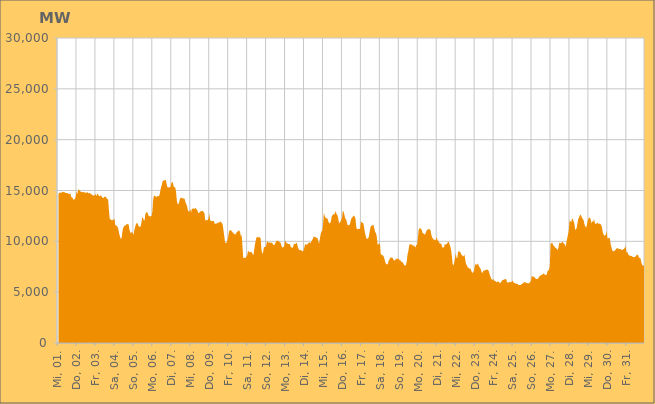
| Category | Series 0 |
|---|---|
|  Mi, 01.  | 14655.966 |
|  Mi, 01.  | 14733.748 |
|  Mi, 01.  | 14804.846 |
|  Mi, 01.  | 14791.034 |
|  Mi, 01.  | 14763.967 |
|  Mi, 01.  | 14899.426 |
|  Mi, 01.  | 14825.837 |
|  Mi, 01.  | 14856.892 |
|  Mi, 01.  | 14807.386 |
|  Mi, 01.  | 14771.504 |
|  Mi, 01.  | 14743.15 |
|  Mi, 01.  | 14767.575 |
|  Mi, 01.  | 14703.543 |
|  Mi, 01.  | 14668.811 |
|  Mi, 01.  | 14644.335 |
|  Mi, 01.  | 14748.163 |
|  Mi, 01.  | 14457.751 |
|  Do, 02.  | 14296.207 |
|  Do, 02.  | 14301.29 |
|  Do, 02.  | 14071.643 |
|  Do, 02.  | 14125.395 |
|  Do, 02.  | 14167.419 |
|  Do, 02.  | 14390.303 |
|  Do, 02.  | 14927.749 |
|  Do, 02.  | 14657.28 |
|  Do, 02.  | 15013.961 |
|  Do, 02.  | 15149.271 |
|  Do, 02.  | 14961.237 |
|  Do, 02.  | 14913.156 |
|  Do, 02.  | 14853.359 |
|  Do, 02.  | 14848.68 |
|  Do, 02.  | 14835.157 |
|  Do, 02.  | 14822.42 |
|  Do, 02.  | 14853.981 |
|  Do, 02.  | 14778.244 |
|  Do, 02.  | 14739.661 |
|  Do, 02.  | 14820.942 |
|  Do, 02.  | 14820.957 |
|  Do, 02.  | 14718.291 |
|  Do, 02.  | 14730.141 |
|  Do, 02.  | 14781.562 |
|  Fr, 03.  | 14643.822 |
|  Fr, 03.  | 14619.324 |
|  Fr, 03.  | 14570.487 |
|  Fr, 03.  | 14487.063 |
|  Fr, 03.  | 14517.622 |
|  Fr, 03.  | 14554.24 |
|  Fr, 03.  | 14644.859 |
|  Fr, 03.  | 14437.796 |
|  Fr, 03.  | 14649.717 |
|  Fr, 03.  | 14646.284 |
|  Fr, 03.  | 14511.99 |
|  Fr, 03.  | 14435.93 |
|  Fr, 03.  | 14480.749 |
|  Fr, 03.  | 14536.33 |
|  Fr, 03.  | 14358.814 |
|  Fr, 03.  | 14281.445 |
|  Fr, 03.  | 14267.614 |
|  Fr, 03.  | 14359.281 |
|  Fr, 03.  | 14385.518 |
|  Fr, 03.  | 14390.92 |
|  Fr, 03.  | 14251.974 |
|  Fr, 03.  | 14168.814 |
|  Fr, 03.  | 14084.986 |
|  Fr, 03.  | 13032.627 |
|  Sa, 04.  | 12193.395 |
|  Sa, 04.  | 12174.506 |
|  Sa, 04.  | 12064.369 |
|  Sa, 04.  | 12116.496 |
|  Sa, 04.  | 12049.264 |
|  Sa, 04.  | 12166.393 |
|  Sa, 04.  | 12240.616 |
|  Sa, 04.  | 11534.338 |
|  Sa, 04.  | 11638.013 |
|  Sa, 04.  | 11459.933 |
|  Sa, 04.  | 11425.39 |
|  Sa, 04.  | 11158.78 |
|  Sa, 04.  | 10715.435 |
|  Sa, 04.  | 10470.063 |
|  Sa, 04.  | 10229.081 |
|  Sa, 04.  | 10337.311 |
|  Sa, 04.  | 10959.154 |
|  Sa, 04.  | 11320.533 |
|  Sa, 04.  | 11459.781 |
|  Sa, 04.  | 11569.307 |
|  Sa, 04.  | 11539.405 |
|  Sa, 04.  | 11676.312 |
|  Sa, 04.  | 11706.265 |
|  Sa, 04.  | 11683.56 |
|  So, 05.  | 11644.197 |
|  So, 05.  | 11117.941 |
|  So, 05.  | 10881.106 |
|  So, 05.  | 10810.582 |
|  So, 05.  | 10949.285 |
|  So, 05.  | 10815.55 |
|  So, 05.  | 10597.796 |
|  So, 05.  | 11069.342 |
|  So, 05.  | 11359.783 |
|  So, 05.  | 11661.53 |
|  So, 05.  | 11791.91 |
|  So, 05.  | 11768.735 |
|  So, 05.  | 11592.437 |
|  So, 05.  | 11421.68 |
|  So, 05.  | 11423.706 |
|  So, 05.  | 11461.153 |
|  So, 05.  | 11776.889 |
|  So, 05.  | 12301.117 |
|  So, 05.  | 12373.301 |
|  So, 05.  | 12072.689 |
|  So, 05.  | 12047.05 |
|  So, 05.  | 12632.758 |
|  So, 05.  | 12863.411 |
|  So, 05.  | 12871.145 |
|  Mo, 06.  | 12777.506 |
|  Mo, 06.  | 12500.077 |
|  Mo, 06.  | 12519.047 |
|  Mo, 06.  | 12425.348 |
|  Mo, 06.  | 12480.143 |
|  Mo, 06.  | 12503.71 |
|  Mo, 06.  | 12985.8 |
|  Mo, 06.  | 14141.296 |
|  Mo, 06.  | 14486.816 |
|  Mo, 06.  | 14479.297 |
|  Mo, 06.  | 14420.485 |
|  Mo, 06.  | 14339.729 |
|  Mo, 06.  | 14455.014 |
|  Mo, 06.  | 14435.036 |
|  Mo, 06.  | 14445.582 |
|  Mo, 06.  | 14553.014 |
|  Mo, 06.  | 14960.045 |
|  Mo, 06.  | 15339.818 |
|  Mo, 06.  | 15574.39 |
|  Mo, 06.  | 15935.479 |
|  Mo, 06.  | 15948.241 |
|  Mo, 06.  | 15994.346 |
|  Mo, 06.  | 16014.523 |
|  Mo, 06.  | 16040.589 |
|  Di, 07.  | 15623.755 |
|  Di, 07.  | 15329.764 |
|  Di, 07.  | 15319.923 |
|  Di, 07.  | 15295.923 |
|  Di, 07.  | 15325.479 |
|  Di, 07.  | 15353.858 |
|  Di, 07.  | 15687.191 |
|  Di, 07.  | 15885.565 |
|  Di, 07.  | 15734.239 |
|  Di, 07.  | 15371.629 |
|  Di, 07.  | 15337.72 |
|  Di, 07.  | 15266.961 |
|  Di, 07.  | 14812.742 |
|  Di, 07.  | 13936.689 |
|  Di, 07.  | 13680.75 |
|  Di, 07.  | 13635.398 |
|  Di, 07.  | 13896.718 |
|  Di, 07.  | 14272.121 |
|  Di, 07.  | 14221.46 |
|  Di, 07.  | 14313.201 |
|  Di, 07.  | 14235.826 |
|  Di, 07.  | 14212.044 |
|  Di, 07.  | 14216.964 |
|  Di, 07.  | 14129.617 |
|  Mi, 08.  | 13808.596 |
|  Mi, 08.  | 13652.023 |
|  Mi, 08.  | 13402.65 |
|  Mi, 08.  | 13042.164 |
|  Mi, 08.  | 12917.61 |
|  Mi, 08.  | 12934.902 |
|  Mi, 08.  | 13178.913 |
|  Mi, 08.  | 12840.211 |
|  Mi, 08.  | 13221.118 |
|  Mi, 08.  | 13189.868 |
|  Mi, 08.  | 13233.706 |
|  Mi, 08.  | 13205.625 |
|  Mi, 08.  | 13252.785 |
|  Mi, 08.  | 13244.731 |
|  Mi, 08.  | 13130.998 |
|  Mi, 08.  | 13035.237 |
|  Mi, 08.  | 12796.304 |
|  Mi, 08.  | 12768.709 |
|  Mi, 08.  | 12902.595 |
|  Mi, 08.  | 12952.829 |
|  Mi, 08.  | 12967.489 |
|  Mi, 08.  | 13003.67 |
|  Mi, 08.  | 12953.156 |
|  Mi, 08.  | 12870.957 |
|  Do, 09.  | 12730.927 |
|  Do, 09.  | 12003.933 |
|  Do, 09.  | 12110.613 |
|  Do, 09.  | 12075.65 |
|  Do, 09.  | 12089.789 |
|  Do, 09.  | 12244.711 |
|  Do, 09.  | 12779.967 |
|  Do, 09.  | 12062.823 |
|  Do, 09.  | 12056.388 |
|  Do, 09.  | 11965.553 |
|  Do, 09.  | 12000.667 |
|  Do, 09.  | 12013.82 |
|  Do, 09.  | 11974.098 |
|  Do, 09.  | 11671.25 |
|  Do, 09.  | 11748.517 |
|  Do, 09.  | 11748.418 |
|  Do, 09.  | 11763.284 |
|  Do, 09.  | 11872.552 |
|  Do, 09.  | 11832.848 |
|  Do, 09.  | 11880.442 |
|  Do, 09.  | 11955.568 |
|  Do, 09.  | 11895.108 |
|  Do, 09.  | 11790.117 |
|  Do, 09.  | 11633.602 |
|  Fr, 10.  | 11067.153 |
|  Fr, 10.  | 10501.582 |
|  Fr, 10.  | 9869.382 |
|  Fr, 10.  | 9847.542 |
|  Fr, 10.  | 9893.957 |
|  Fr, 10.  | 10141.984 |
|  Fr, 10.  | 10489.722 |
|  Fr, 10.  | 10958.405 |
|  Fr, 10.  | 11105.193 |
|  Fr, 10.  | 11092.675 |
|  Fr, 10.  | 11033.681 |
|  Fr, 10.  | 10906.27 |
|  Fr, 10.  | 10860.775 |
|  Fr, 10.  | 10737.93 |
|  Fr, 10.  | 10731.035 |
|  Fr, 10.  | 10653.992 |
|  Fr, 10.  | 10812.126 |
|  Fr, 10.  | 10899.976 |
|  Fr, 10.  | 10964.931 |
|  Fr, 10.  | 11050.584 |
|  Fr, 10.  | 11063.817 |
|  Fr, 10.  | 10872.576 |
|  Fr, 10.  | 10494.995 |
|  Fr, 10.  | 10595.172 |
|  Sa, 11.  | 9493.104 |
|  Sa, 11.  | 8325.465 |
|  Sa, 11.  | 8383.988 |
|  Sa, 11.  | 8380.871 |
|  Sa, 11.  | 8381.42 |
|  Sa, 11.  | 8526.643 |
|  Sa, 11.  | 8603.912 |
|  Sa, 11.  | 9046.665 |
|  Sa, 11.  | 9022.051 |
|  Sa, 11.  | 8920.277 |
|  Sa, 11.  | 8928.758 |
|  Sa, 11.  | 8975.622 |
|  Sa, 11.  | 8882.01 |
|  Sa, 11.  | 8713.747 |
|  Sa, 11.  | 8660.94 |
|  Sa, 11.  | 9277.089 |
|  Sa, 11.  | 9780.474 |
|  Sa, 11.  | 10146.337 |
|  Sa, 11.  | 10427.806 |
|  Sa, 11.  | 10410.118 |
|  Sa, 11.  | 10369.918 |
|  Sa, 11.  | 10466.3 |
|  Sa, 11.  | 10363.228 |
|  Sa, 11.  | 10266.48 |
|  So, 12.  | 9208.454 |
|  So, 12.  | 8774.162 |
|  So, 12.  | 8890.21 |
|  So, 12.  | 9382.609 |
|  So, 12.  | 9453.427 |
|  So, 12.  | 9431.643 |
|  So, 12.  | 9552.772 |
|  So, 12.  | 10016.847 |
|  So, 12.  | 9957.488 |
|  So, 12.  | 9859.997 |
|  So, 12.  | 9904.787 |
|  So, 12.  | 9836.543 |
|  So, 12.  | 9886.833 |
|  So, 12.  | 9859.021 |
|  So, 12.  | 9810.344 |
|  So, 12.  | 9649.421 |
|  So, 12.  | 9630.395 |
|  So, 12.  | 9713.14 |
|  So, 12.  | 9888.949 |
|  So, 12.  | 10049.359 |
|  So, 12.  | 10076.963 |
|  So, 12.  | 10018.928 |
|  So, 12.  | 10007.389 |
|  So, 12.  | 9919.556 |
|  Mo, 13.  | 9889.385 |
|  Mo, 13.  | 9674.745 |
|  Mo, 13.  | 9425.693 |
|  Mo, 13.  | 9383.575 |
|  Mo, 13.  | 9469.14 |
|  Mo, 13.  | 9560.055 |
|  Mo, 13.  | 10087.87 |
|  Mo, 13.  | 9948.807 |
|  Mo, 13.  | 9825.674 |
|  Mo, 13.  | 9778.155 |
|  Mo, 13.  | 9731.175 |
|  Mo, 13.  | 9746.002 |
|  Mo, 13.  | 9710.783 |
|  Mo, 13.  | 9478.448 |
|  Mo, 13.  | 9413.707 |
|  Mo, 13.  | 9318.38 |
|  Mo, 13.  | 9454.378 |
|  Mo, 13.  | 9703.296 |
|  Mo, 13.  | 9772.598 |
|  Mo, 13.  | 9742.375 |
|  Mo, 13.  | 9820.493 |
|  Mo, 13.  | 9849.61 |
|  Mo, 13.  | 9432.822 |
|  Mo, 13.  | 9252.312 |
|  Di, 14.  | 9138.523 |
|  Di, 14.  | 9120.539 |
|  Di, 14.  | 9170.79 |
|  Di, 14.  | 9055.338 |
|  Di, 14.  | 9017.018 |
|  Di, 14.  | 9059.823 |
|  Di, 14.  | 9280.34 |
|  Di, 14.  | 9678.758 |
|  Di, 14.  | 9716 |
|  Di, 14.  | 9655.533 |
|  Di, 14.  | 9677.863 |
|  Di, 14.  | 9860.119 |
|  Di, 14.  | 9808.459 |
|  Di, 14.  | 9920.384 |
|  Di, 14.  | 9839.352 |
|  Di, 14.  | 9937.655 |
|  Di, 14.  | 10117.11 |
|  Di, 14.  | 10225.676 |
|  Di, 14.  | 10470.794 |
|  Di, 14.  | 10425.812 |
|  Di, 14.  | 10453.314 |
|  Di, 14.  | 10363.194 |
|  Di, 14.  | 10320.85 |
|  Di, 14.  | 10326.324 |
|  Mi, 15.  | 9993.125 |
|  Mi, 15.  | 9767.859 |
|  Mi, 15.  | 10274.832 |
|  Mi, 15.  | 10736.522 |
|  Mi, 15.  | 10997.703 |
|  Mi, 15.  | 11007.196 |
|  Mi, 15.  | 11667.046 |
|  Mi, 15.  | 12781.963 |
|  Mi, 15.  | 12536.21 |
|  Mi, 15.  | 12341.159 |
|  Mi, 15.  | 12255.969 |
|  Mi, 15.  | 12286.447 |
|  Mi, 15.  | 12145.081 |
|  Mi, 15.  | 11884.349 |
|  Mi, 15.  | 11778.736 |
|  Mi, 15.  | 11780.034 |
|  Mi, 15.  | 12004.808 |
|  Mi, 15.  | 12459.01 |
|  Mi, 15.  | 12560.003 |
|  Mi, 15.  | 12685.579 |
|  Mi, 15.  | 12624.539 |
|  Mi, 15.  | 12769.993 |
|  Mi, 15.  | 12988.618 |
|  Mi, 15.  | 12681.687 |
|  Do, 16.  | 12619.526 |
|  Do, 16.  | 12320.989 |
|  Do, 16.  | 11871.073 |
|  Do, 16.  | 11783.079 |
|  Do, 16.  | 11935.523 |
|  Do, 16.  | 12116.827 |
|  Do, 16.  | 12333.657 |
|  Do, 16.  | 13011.252 |
|  Do, 16.  | 12918.779 |
|  Do, 16.  | 12620.382 |
|  Do, 16.  | 12269.05 |
|  Do, 16.  | 12170.493 |
|  Do, 16.  | 11927.653 |
|  Do, 16.  | 11610.45 |
|  Do, 16.  | 11556.575 |
|  Do, 16.  | 11620.152 |
|  Do, 16.  | 11655.151 |
|  Do, 16.  | 12042.741 |
|  Do, 16.  | 12289.665 |
|  Do, 16.  | 12321.954 |
|  Do, 16.  | 12486.495 |
|  Do, 16.  | 12536.285 |
|  Do, 16.  | 12426.765 |
|  Do, 16.  | 12252.819 |
|  Fr, 17.  | 11434.18 |
|  Fr, 17.  | 11163.01 |
|  Fr, 17.  | 11220.681 |
|  Fr, 17.  | 11230.868 |
|  Fr, 17.  | 11207.006 |
|  Fr, 17.  | 11295.368 |
|  Fr, 17.  | 12006.42 |
|  Fr, 17.  | 11859.203 |
|  Fr, 17.  | 11813.987 |
|  Fr, 17.  | 11776.97 |
|  Fr, 17.  | 11337.294 |
|  Fr, 17.  | 10839.146 |
|  Fr, 17.  | 10528.876 |
|  Fr, 17.  | 10267.757 |
|  Fr, 17.  | 10239.301 |
|  Fr, 17.  | 10283.012 |
|  Fr, 17.  | 10458.456 |
|  Fr, 17.  | 10956.487 |
|  Fr, 17.  | 11378.761 |
|  Fr, 17.  | 11524.398 |
|  Fr, 17.  | 11543.753 |
|  Fr, 17.  | 11620.082 |
|  Fr, 17.  | 11552.402 |
|  Fr, 17.  | 11261.032 |
|  Sa, 18.  | 10903.127 |
|  Sa, 18.  | 10813.395 |
|  Sa, 18.  | 10481.264 |
|  Sa, 18.  | 9685.847 |
|  Sa, 18.  | 9722.56 |
|  Sa, 18.  | 9724.425 |
|  Sa, 18.  | 9847.139 |
|  Sa, 18.  | 8707.106 |
|  Sa, 18.  | 8694.945 |
|  Sa, 18.  | 8651.087 |
|  Sa, 18.  | 8591.887 |
|  Sa, 18.  | 8466.432 |
|  Sa, 18.  | 8186.9 |
|  Sa, 18.  | 7870.374 |
|  Sa, 18.  | 7781.616 |
|  Sa, 18.  | 7718.371 |
|  Sa, 18.  | 7793.159 |
|  Sa, 18.  | 8090.646 |
|  Sa, 18.  | 8218.846 |
|  Sa, 18.  | 8381.333 |
|  Sa, 18.  | 8423.03 |
|  Sa, 18.  | 8376.086 |
|  Sa, 18.  | 8393.509 |
|  Sa, 18.  | 8210.449 |
|  So, 19.  | 8095.024 |
|  So, 19.  | 8147.387 |
|  So, 19.  | 8267.612 |
|  So, 19.  | 8275.823 |
|  So, 19.  | 8282.862 |
|  So, 19.  | 8277.186 |
|  So, 19.  | 8282.985 |
|  So, 19.  | 8123.536 |
|  So, 19.  | 8137.497 |
|  So, 19.  | 7986.129 |
|  So, 19.  | 7931.596 |
|  So, 19.  | 7957.966 |
|  So, 19.  | 7764.857 |
|  So, 19.  | 7619.188 |
|  So, 19.  | 7628.695 |
|  So, 19.  | 7687.321 |
|  So, 19.  | 8071.487 |
|  So, 19.  | 8733.751 |
|  So, 19.  | 9054.661 |
|  So, 19.  | 9593.808 |
|  So, 19.  | 9737.694 |
|  So, 19.  | 9692.847 |
|  So, 19.  | 9687.026 |
|  So, 19.  | 9645.602 |
|  Mo, 20.  | 9507.06 |
|  Mo, 20.  | 9646.38 |
|  Mo, 20.  | 9487.83 |
|  Mo, 20.  | 9386.233 |
|  Mo, 20.  | 9645.294 |
|  Mo, 20.  | 9667.041 |
|  Mo, 20.  | 10283.981 |
|  Mo, 20.  | 11107.165 |
|  Mo, 20.  | 11276.106 |
|  Mo, 20.  | 11277.891 |
|  Mo, 20.  | 11227.246 |
|  Mo, 20.  | 11099.461 |
|  Mo, 20.  | 10800.615 |
|  Mo, 20.  | 10806.522 |
|  Mo, 20.  | 10649.699 |
|  Mo, 20.  | 10699.831 |
|  Mo, 20.  | 10827.767 |
|  Mo, 20.  | 11064.504 |
|  Mo, 20.  | 11128.579 |
|  Mo, 20.  | 11202.278 |
|  Mo, 20.  | 11167.226 |
|  Mo, 20.  | 11211.45 |
|  Mo, 20.  | 11085.322 |
|  Mo, 20.  | 10667.212 |
|  Di, 21.  | 10368.134 |
|  Di, 21.  | 10310.261 |
|  Di, 21.  | 10162.134 |
|  Di, 21.  | 10173.384 |
|  Di, 21.  | 10094.188 |
|  Di, 21.  | 10179.811 |
|  Di, 21.  | 10433.976 |
|  Di, 21.  | 10088.205 |
|  Di, 21.  | 10065.299 |
|  Di, 21.  | 9867.756 |
|  Di, 21.  | 9787.24 |
|  Di, 21.  | 9780.144 |
|  Di, 21.  | 9688.532 |
|  Di, 21.  | 9358.015 |
|  Di, 21.  | 9443.56 |
|  Di, 21.  | 9370.908 |
|  Di, 21.  | 9707.041 |
|  Di, 21.  | 9674.125 |
|  Di, 21.  | 9729.834 |
|  Di, 21.  | 9762.105 |
|  Di, 21.  | 9958.202 |
|  Di, 21.  | 9964.607 |
|  Di, 21.  | 9746.965 |
|  Di, 21.  | 9492.426 |
|  Mi, 22.  | 9162.624 |
|  Mi, 22.  | 8597.355 |
|  Mi, 22.  | 7790.203 |
|  Mi, 22.  | 7603.91 |
|  Mi, 22.  | 7888.667 |
|  Mi, 22.  | 8322.67 |
|  Mi, 22.  | 8842.564 |
|  Mi, 22.  | 8353.488 |
|  Mi, 22.  | 8368.048 |
|  Mi, 22.  | 8996.731 |
|  Mi, 22.  | 8998.265 |
|  Mi, 22.  | 8979.994 |
|  Mi, 22.  | 8908.143 |
|  Mi, 22.  | 8671.282 |
|  Mi, 22.  | 8660.969 |
|  Mi, 22.  | 8522.549 |
|  Mi, 22.  | 8529.332 |
|  Mi, 22.  | 8725.748 |
|  Mi, 22.  | 8162.608 |
|  Mi, 22.  | 7741.928 |
|  Mi, 22.  | 7689.556 |
|  Mi, 22.  | 7445.04 |
|  Mi, 22.  | 7413.568 |
|  Mi, 22.  | 7321.795 |
|  Do, 23.  | 7297.057 |
|  Do, 23.  | 7289.331 |
|  Do, 23.  | 7020.495 |
|  Do, 23.  | 6896.881 |
|  Do, 23.  | 6965.937 |
|  Do, 23.  | 7096.543 |
|  Do, 23.  | 7520.754 |
|  Do, 23.  | 7774.391 |
|  Do, 23.  | 7686.828 |
|  Do, 23.  | 7728.739 |
|  Do, 23.  | 7829.137 |
|  Do, 23.  | 7592.458 |
|  Do, 23.  | 7458.254 |
|  Do, 23.  | 7357.709 |
|  Do, 23.  | 7153.783 |
|  Do, 23.  | 6903.766 |
|  Do, 23.  | 6913.354 |
|  Do, 23.  | 7129.752 |
|  Do, 23.  | 7086.515 |
|  Do, 23.  | 7163.493 |
|  Do, 23.  | 7207.345 |
|  Do, 23.  | 7191.919 |
|  Do, 23.  | 7228.001 |
|  Do, 23.  | 7154.101 |
|  Fr, 24.  | 7030.301 |
|  Fr, 24.  | 6728.244 |
|  Fr, 24.  | 6508.554 |
|  Fr, 24.  | 6278.045 |
|  Fr, 24.  | 6249.903 |
|  Fr, 24.  | 6203.082 |
|  Fr, 24.  | 6271.888 |
|  Fr, 24.  | 6084.442 |
|  Fr, 24.  | 6112.818 |
|  Fr, 24.  | 6015.344 |
|  Fr, 24.  | 5983.242 |
|  Fr, 24.  | 6038.047 |
|  Fr, 24.  | 6043.144 |
|  Fr, 24.  | 5949.043 |
|  Fr, 24.  | 5896.748 |
|  Fr, 24.  | 5944.499 |
|  Fr, 24.  | 6073.864 |
|  Fr, 24.  | 6184.805 |
|  Fr, 24.  | 6208.577 |
|  Fr, 24.  | 6224.011 |
|  Fr, 24.  | 6274.419 |
|  Fr, 24.  | 6295.743 |
|  Fr, 24.  | 6223.813 |
|  Fr, 24.  | 5960.985 |
|  Sa, 25.  | 5944.387 |
|  Sa, 25.  | 5965.458 |
|  Sa, 25.  | 5994.446 |
|  Sa, 25.  | 5991.607 |
|  Sa, 25.  | 5973.393 |
|  Sa, 25.  | 6065.297 |
|  Sa, 25.  | 6161.834 |
|  Sa, 25.  | 5928.427 |
|  Sa, 25.  | 5922.154 |
|  Sa, 25.  | 5901.875 |
|  Sa, 25.  | 5808.509 |
|  Sa, 25.  | 5841.928 |
|  Sa, 25.  | 5817.921 |
|  Sa, 25.  | 5733.32 |
|  Sa, 25.  | 5690.574 |
|  Sa, 25.  | 5712.96 |
|  Sa, 25.  | 5698.131 |
|  Sa, 25.  | 5765.283 |
|  Sa, 25.  | 5821.896 |
|  Sa, 25.  | 5864.291 |
|  Sa, 25.  | 5958.192 |
|  Sa, 25.  | 5975.131 |
|  Sa, 25.  | 5971.38 |
|  Sa, 25.  | 5910.7 |
|  So, 26.  | 5902.613 |
|  So, 26.  | 5878.555 |
|  So, 26.  | 5862.719 |
|  So, 26.  | 5887.048 |
|  So, 26.  | 6020.328 |
|  So, 26.  | 6033.706 |
|  So, 26.  | 6577.793 |
|  So, 26.  | 6533.109 |
|  So, 26.  | 6545.212 |
|  So, 26.  | 6501.196 |
|  So, 26.  | 6418.024 |
|  So, 26.  | 6336.115 |
|  So, 26.  | 6305.362 |
|  So, 26.  | 6297.699 |
|  So, 26.  | 6305.933 |
|  So, 26.  | 6455.174 |
|  So, 26.  | 6567.947 |
|  So, 26.  | 6628.768 |
|  So, 26.  | 6674.295 |
|  So, 26.  | 6690.919 |
|  So, 26.  | 6774.774 |
|  So, 26.  | 6844.542 |
|  So, 26.  | 6770.353 |
|  Mo, 27.  | 6719.009 |
|  Mo, 27.  | 6660.638 |
|  Mo, 27.  | 6727.845 |
|  Mo, 27.  | 7025.526 |
|  Mo, 27.  | 7129.536 |
|  Mo, 27.  | 7230.479 |
|  Mo, 27.  | 7547.477 |
|  Mo, 27.  | 9696.151 |
|  Mo, 27.  | 9810.182 |
|  Mo, 27.  | 9897.151 |
|  Mo, 27.  | 9672.349 |
|  Mo, 27.  | 9540.028 |
|  Mo, 27.  | 9493.759 |
|  Mo, 27.  | 9362.458 |
|  Mo, 27.  | 9318.235 |
|  Mo, 27.  | 9236.446 |
|  Mo, 27.  | 9124.714 |
|  Mo, 27.  | 9418.684 |
|  Mo, 27.  | 9886.028 |
|  Mo, 27.  | 9803.122 |
|  Mo, 27.  | 9822.403 |
|  Mo, 27.  | 9892.795 |
|  Mo, 27.  | 9957.124 |
|  Mo, 27.  | 9858.867 |
|  Di, 28.  | 9784.112 |
|  Di, 28.  | 9684.093 |
|  Di, 28.  | 9476.547 |
|  Di, 28.  | 9876.642 |
|  Di, 28.  | 10277.587 |
|  Di, 28.  | 10648.812 |
|  Di, 28.  | 11038.685 |
|  Di, 28.  | 12041.866 |
|  Di, 28.  | 11991.562 |
|  Di, 28.  | 11884.934 |
|  Di, 28.  | 12179.134 |
|  Di, 28.  | 12230.683 |
|  Di, 28.  | 11997.546 |
|  Di, 28.  | 11792.199 |
|  Di, 28.  | 11224.886 |
|  Di, 28.  | 11115.817 |
|  Di, 28.  | 11326.682 |
|  Di, 28.  | 11751.331 |
|  Di, 28.  | 12198.865 |
|  Di, 28.  | 12335.291 |
|  Di, 28.  | 12554.511 |
|  Di, 28.  | 12633.315 |
|  Di, 28.  | 12456.554 |
|  Di, 28.  | 12304.129 |
|  Mi, 29.  | 12170.654 |
|  Mi, 29.  | 12044.845 |
|  Mi, 29.  | 11612.085 |
|  Mi, 29.  | 11466.08 |
|  Mi, 29.  | 11337.943 |
|  Mi, 29.  | 11627.379 |
|  Mi, 29.  | 12031.585 |
|  Mi, 29.  | 12258.19 |
|  Mi, 29.  | 12315.188 |
|  Mi, 29.  | 12327.936 |
|  Mi, 29.  | 12052.613 |
|  Mi, 29.  | 11752.659 |
|  Mi, 29.  | 11994.112 |
|  Mi, 29.  | 11904.9 |
|  Mi, 29.  | 12188.457 |
|  Mi, 29.  | 11836.911 |
|  Mi, 29.  | 11694.11 |
|  Mi, 29.  | 11739.805 |
|  Mi, 29.  | 11847.142 |
|  Mi, 29.  | 11764.326 |
|  Mi, 29.  | 11683.162 |
|  Mi, 29.  | 11768.933 |
|  Mi, 29.  | 11689.121 |
|  Mi, 29.  | 11630.138 |
|  Do, 30.  | 11392.906 |
|  Do, 30.  | 10916.088 |
|  Do, 30.  | 10674.13 |
|  Do, 30.  | 10537.013 |
|  Do, 30.  | 10594.56 |
|  Do, 30.  | 10672.79 |
|  Do, 30.  | 11019.005 |
|  Do, 30.  | 10254.081 |
|  Do, 30.  | 10318.476 |
|  Do, 30.  | 10357.587 |
|  Do, 30.  | 10258.505 |
|  Do, 30.  | 9739.446 |
|  Do, 30.  | 9437.082 |
|  Do, 30.  | 9111.631 |
|  Do, 30.  | 9018.495 |
|  Do, 30.  | 9012.344 |
|  Do, 30.  | 9088.679 |
|  Do, 30.  | 9126.021 |
|  Do, 30.  | 9295.069 |
|  Do, 30.  | 9298.553 |
|  Do, 30.  | 9321.654 |
|  Do, 30.  | 9262.404 |
|  Do, 30.  | 9227.692 |
|  Do, 30.  | 9236.548 |
|  Fr, 31.  | 9237.206 |
|  Fr, 31.  | 9122.274 |
|  Fr, 31.  | 9163.559 |
|  Fr, 31.  | 9213.643 |
|  Fr, 31.  | 9261.821 |
|  Fr, 31.  | 9385.785 |
|  Fr, 31.  | 9530.218 |
|  Fr, 31.  | 8895.057 |
|  Fr, 31.  | 8973.326 |
|  Fr, 31.  | 8757.037 |
|  Fr, 31.  | 8658.034 |
|  Fr, 31.  | 8588.124 |
|  Fr, 31.  | 8588.001 |
|  Fr, 31.  | 8557.853 |
|  Fr, 31.  | 8524.441 |
|  Fr, 31.  | 8470.568 |
|  Fr, 31.  | 8447.007 |
|  Fr, 31.  | 8444.049 |
|  Fr, 31.  | 8512.09 |
|  Fr, 31.  | 8524.449 |
|  Fr, 31.  | 8689.742 |
|  Fr, 31.  | 8676.868 |
|  Fr, 31.  | 8609.865 |
|  Fr, 31.  | 8329.073 |
|  Sa, 01.  | 8411.698 |
|  Sa, 01.  | 8266.973 |
|  Sa, 01.  | 7855.667 |
|  Sa, 01.  | 7693.143 |
|  Sa, 01.  | 7587.612 |
|  Sa, 01.  | 7602.525 |
|    | 7711.739 |